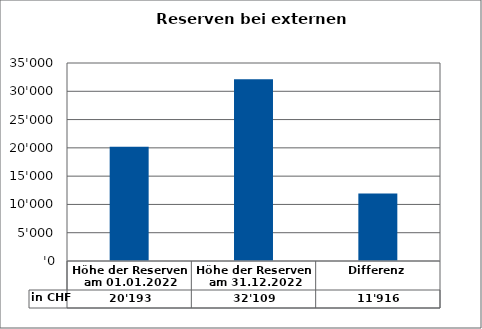
| Category | in CHF |
|---|---|
| Höhe der Reserven am 01.01.2022 | 20193.2 |
| Höhe der Reserven am 31.12.2022 | 32109.12 |
| Differenz | 11915.92 |